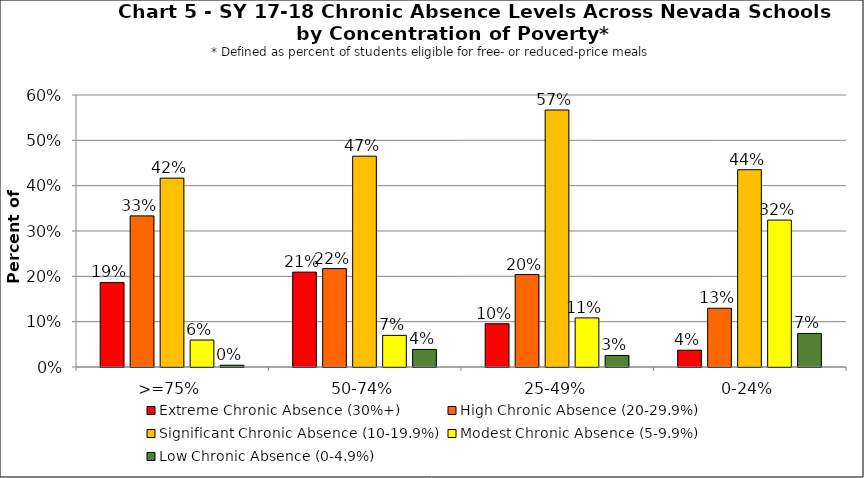
| Category | Extreme Chronic Absence (30%+) | High Chronic Absence (20-29.9%) | Significant Chronic Absence (10-19.9%) | Modest Chronic Absence (5-9.9%) | Low Chronic Absence (0-4.9%) |
|---|---|---|---|---|---|
| 0 | 0.187 | 0.333 | 0.417 | 0.06 | 0.004 |
| 1 | 0.209 | 0.217 | 0.465 | 0.07 | 0.039 |
| 2 | 0.096 | 0.204 | 0.567 | 0.108 | 0.025 |
| 3 | 0.037 | 0.13 | 0.435 | 0.324 | 0.074 |